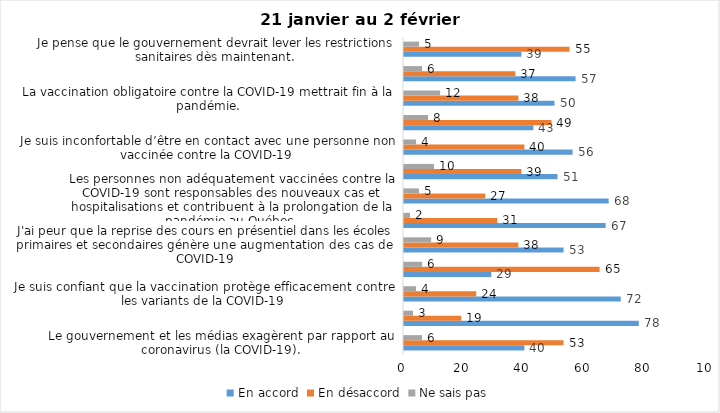
| Category | En accord | En désaccord | Ne sais pas |
|---|---|---|---|
| Le gouvernement et les médias exagèrent par rapport au coronavirus (la COVID-19). | 40 | 53 | 6 |
| J’ai peur que le système de santé soit débordé par les cas de COVID-19. | 78 | 19 | 3 |
| Je suis confiant que la vaccination protège efficacement contre les variants de la COVID-19 | 72 | 24 | 4 |
| Je suis favorable à ce que le port du masque ne soit plus obligatoire au Québec. | 29 | 65 | 6 |
| J'ai peur que la reprise des cours en présentiel dans les écoles primaires et secondaires génère une augmentation des cas de COVID-19 | 53 | 38 | 9 |
| Je crois que le passeport vaccinal devrait être requis pour davantage de services et commerces (ex. : spas, centre d’achats, centre de soins personnels. | 67 | 31 | 2 |
| Les personnes non adéquatement vaccinées contre la COVID-19 sont responsables des nouveaux cas et hospitalisations et contribuent à la prolongation de la pandémie au Québec. | 68 | 27 | 5 |
| La pandémie ne sera pas terminée au Québec avant que tous les habitants de la terre puissent être vaccinés contre la COVID-19.   | 51 | 39 | 10 |
| Je suis inconfortable d’être en contact avec une personne non vaccinée contre la COVID-19 | 56 | 40 | 4 |
| Je n'ai pas peur du variant Omicron, car il semble moins dangereux pour la santé. | 43 | 49 | 8 |
| La vaccination obligatoire contre la COVID-19 mettrait fin à la pandémie. | 50 | 38 | 12 |
| Je suis favorable à ce que les personnes non vaccinées paient une taxe supplémentaire (contribution santé). | 57 | 37 | 6 |
| Je pense que le gouvernement devrait lever les restrictions sanitaires dès maintenant. | 39 | 55 | 5 |